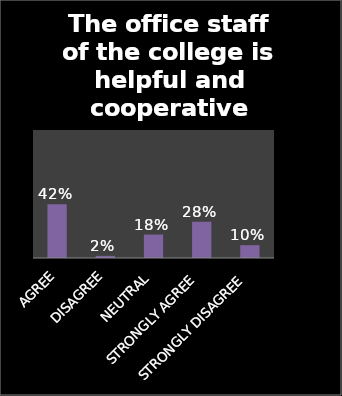
| Category | Series 0 |
|---|---|
| AGREE | 0.42 |
| DISAGREE | 0.017 |
| NEUTRAL | 0.183 |
| STRONGLY AGREE | 0.283 |
| STRONGLY DISAGREE | 0.1 |